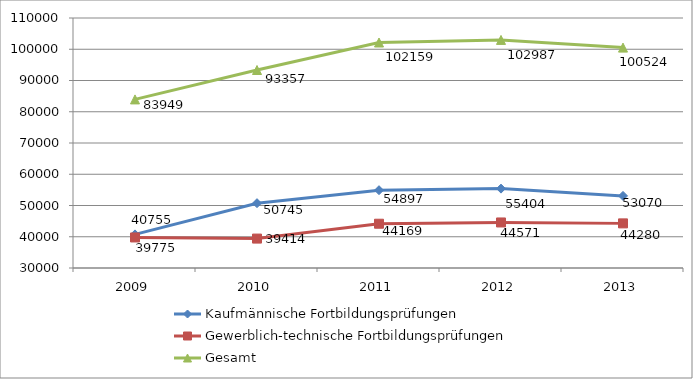
| Category | Kaufmännische Fortbildungsprüfungen | Gewerblich-technische Fortbildungsprüfungen | Gesamt |
|---|---|---|---|
| 2009.0 | 40755 | 39775 | 83949 |
| 2010.0 | 50745 | 39414 | 93357 |
| 2011.0 | 54897 | 44169 | 102159 |
| 2012.0 | 55404 | 44571 | 102987 |
| 2013.0 | 53070 | 44280 | 100524 |